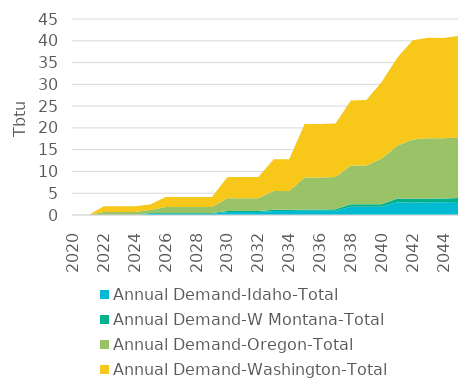
| Category | Annual Demand-Idaho-Total | Annual Demand-W Montana-Total | Annual Demand-Oregon-Total | Annual Demand-Washington-Total |
|---|---|---|---|---|
| 2020.0 | 0 | 0 | 0 | 0 |
| 2021.0 | 0 | 0 | 0 | 0 |
| 2022.0 | 0 | 0 | 0.7 | 1.3 |
| 2023.0 | 0 | 0 | 0.7 | 1.3 |
| 2024.0 | 0 | 0 | 0.7 | 1.3 |
| 2025.0 | 0.3 | 0.138 | 0.7 | 1.3 |
| 2026.0 | 0.3 | 0.138 | 1.4 | 2.3 |
| 2027.0 | 0.3 | 0.138 | 1.4 | 2.3 |
| 2028.0 | 0.3 | 0.138 | 1.4 | 2.3 |
| 2029.0 | 0.3 | 0.138 | 1.4 | 2.3 |
| 2030.0 | 0.7 | 0.233 | 2.9 | 4.9 |
| 2031.0 | 0.7 | 0.233 | 2.9 | 4.9 |
| 2032.0 | 0.7 | 0.233 | 2.9 | 4.9 |
| 2033.0 | 0.9 | 0.283 | 4.3 | 7.3 |
| 2034.0 | 0.9 | 0.283 | 4.3 | 7.3 |
| 2035.0 | 1 | 0.283 | 7.3 | 12.3 |
| 2036.0 | 1 | 0.283 | 7.3 | 12.3 |
| 2037.0 | 1 | 0.335 | 7.4 | 12.3 |
| 2038.0 | 1.9 | 0.575 | 8.9 | 14.9 |
| 2039.0 | 1.9 | 0.575 | 8.9 | 15 |
| 2040.0 | 1.9 | 0.575 | 10.5 | 17.6 |
| 2041.0 | 2.9 | 0.91 | 12.1 | 20.2 |
| 2042.0 | 2.8 | 0.91 | 13.6 | 22.8 |
| 2043.0 | 2.9 | 0.91 | 13.8 | 23.1 |
| 2044.0 | 2.9 | 0.91 | 13.8 | 23 |
| 2045.0 | 3 | 0.91 | 13.9 | 23.3 |